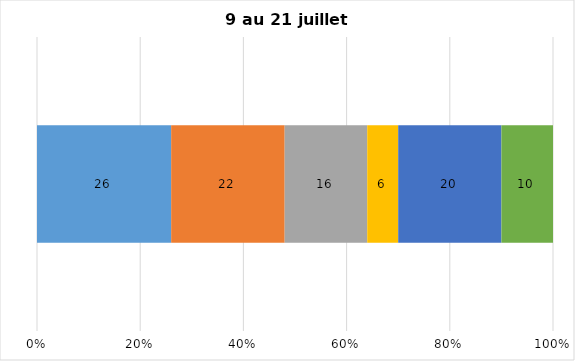
| Category | Plusieurs fois par jour | Une fois par jour | Quelques fois par semaine   | Une fois par semaine ou moins   |  Jamais   |  Je n’utilise pas les médias sociaux |
|---|---|---|---|---|---|---|
| 0 | 26 | 22 | 16 | 6 | 20 | 10 |